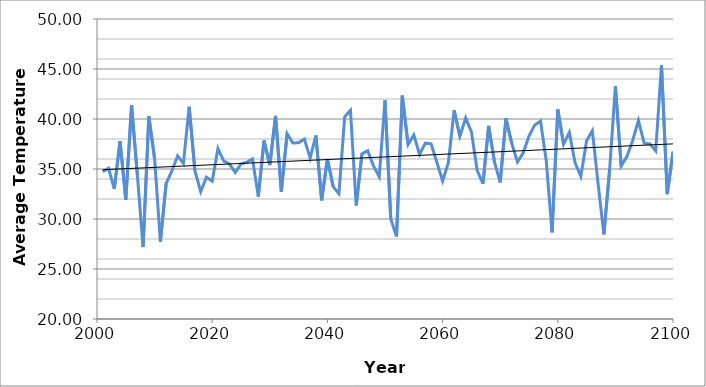
| Category | B1 |
|---|---|
| 2001.0 | 34.731 |
| 2002.0 | 35.076 |
| 2003.0 | 33.01 |
| 2004.0 | 37.785 |
| 2005.0 | 31.944 |
| 2006.0 | 41.4 |
| 2007.0 | 34.444 |
| 2008.0 | 27.198 |
| 2009.0 | 40.266 |
| 2010.0 | 36.03 |
| 2011.0 | 27.743 |
| 2012.0 | 33.535 |
| 2013.0 | 34.801 |
| 2014.0 | 36.32 |
| 2015.0 | 35.562 |
| 2016.0 | 41.225 |
| 2017.0 | 34.824 |
| 2018.0 | 32.736 |
| 2019.0 | 34.178 |
| 2020.0 | 33.778 |
| 2021.0 | 37.049 |
| 2022.0 | 35.796 |
| 2023.0 | 35.501 |
| 2024.0 | 34.65 |
| 2025.0 | 35.503 |
| 2026.0 | 35.685 |
| 2027.0 | 35.998 |
| 2028.0 | 32.25 |
| 2029.0 | 37.837 |
| 2030.0 | 35.393 |
| 2031.0 | 40.302 |
| 2032.0 | 32.74 |
| 2033.0 | 38.538 |
| 2034.0 | 37.594 |
| 2035.0 | 37.632 |
| 2036.0 | 37.996 |
| 2037.0 | 36.102 |
| 2038.0 | 38.35 |
| 2039.0 | 31.874 |
| 2040.0 | 35.992 |
| 2041.0 | 33.237 |
| 2042.0 | 32.54 |
| 2043.0 | 40.212 |
| 2044.0 | 40.872 |
| 2045.0 | 31.37 |
| 2046.0 | 36.534 |
| 2047.0 | 36.811 |
| 2048.0 | 35.316 |
| 2049.0 | 34.236 |
| 2050.0 | 41.859 |
| 2051.0 | 30.011 |
| 2052.0 | 28.258 |
| 2053.0 | 42.337 |
| 2054.0 | 37.458 |
| 2055.0 | 38.41 |
| 2056.0 | 36.451 |
| 2057.0 | 37.587 |
| 2058.0 | 37.515 |
| 2059.0 | 35.67 |
| 2060.0 | 33.795 |
| 2061.0 | 35.632 |
| 2062.0 | 40.87 |
| 2063.0 | 38.277 |
| 2064.0 | 40.105 |
| 2065.0 | 38.71 |
| 2066.0 | 34.864 |
| 2067.0 | 33.546 |
| 2068.0 | 39.312 |
| 2069.0 | 35.713 |
| 2070.0 | 33.67 |
| 2071.0 | 40.064 |
| 2072.0 | 37.553 |
| 2073.0 | 35.697 |
| 2074.0 | 36.619 |
| 2075.0 | 38.291 |
| 2076.0 | 39.407 |
| 2077.0 | 39.799 |
| 2078.0 | 35.798 |
| 2079.0 | 28.663 |
| 2080.0 | 40.959 |
| 2081.0 | 37.486 |
| 2082.0 | 38.658 |
| 2083.0 | 35.614 |
| 2084.0 | 34.264 |
| 2085.0 | 37.818 |
| 2086.0 | 38.829 |
| 2087.0 | 33.516 |
| 2088.0 | 28.474 |
| 2089.0 | 34.961 |
| 2090.0 | 43.281 |
| 2091.0 | 35.31 |
| 2092.0 | 36.243 |
| 2093.0 | 37.857 |
| 2094.0 | 39.844 |
| 2095.0 | 37.584 |
| 2096.0 | 37.513 |
| 2097.0 | 36.815 |
| 2098.0 | 45.376 |
| 2099.0 | 32.486 |
| 2100.0 | 36.72 |